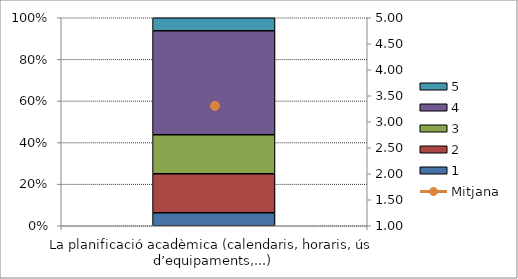
| Category | 1 | 2 | 3 | 4 | 5 |
|---|---|---|---|---|---|
| La planificació acadèmica (calendaris, horaris, ús d’equipaments,...) | 1 | 3 | 3 | 8 | 1 |